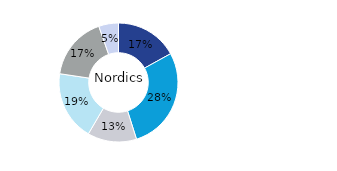
| Category | Nordics |
|---|---|
| Office | 0.17 |
| Residential | 0.281 |
| Retail | 0.133 |
| Logistics* | 0.189 |
| Public Sector | 0.173 |
| Other | 0.054 |